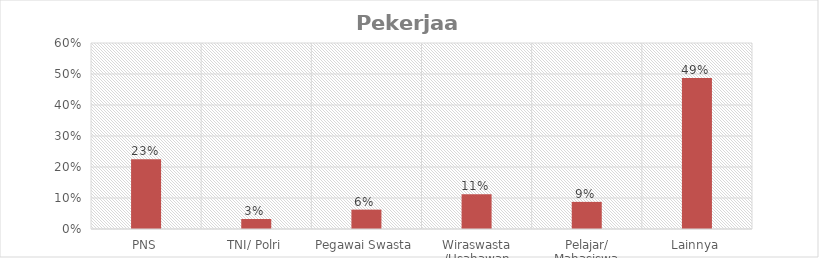
| Category | Pekerjaan |
|---|---|
| PNS | 0.225 |
| TNI/ Polri | 0.032 |
| Pegawai Swasta | 0.062 |
| Wiraswasta /Usahawan | 0.112 |
| Pelajar/ Mahasiswa | 0.088 |
| Lainnya | 0.488 |